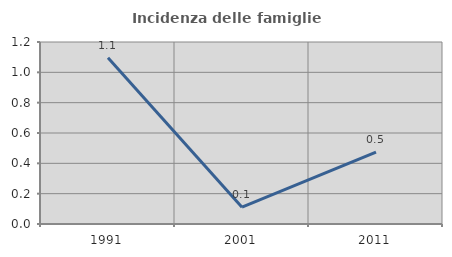
| Category | Incidenza delle famiglie numerose |
|---|---|
| 1991.0 | 1.096 |
| 2001.0 | 0.111 |
| 2011.0 | 0.474 |